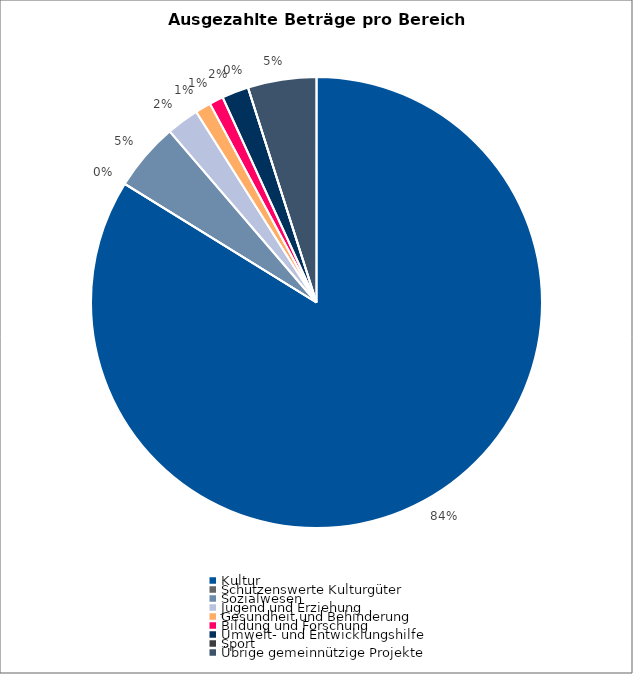
| Category | Series 0 |
|---|---|
| Kultur | 8784393.68 |
| Schützenswerte Kulturgüter | 0 |
| Sozialwesen | 512623 |
| Jugend und Erziehung | 243698 |
| Gesundheit und Behinderung | 118400 |
| Bildung und Forschung | 105101 |
| Umwelt- und Entwicklungshilfe | 201000 |
| Sport | 0 |
| Übrige gemeinnützige Projekte | 515122 |